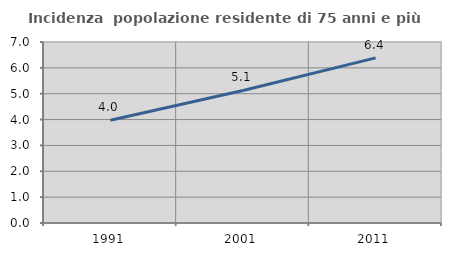
| Category | Incidenza  popolazione residente di 75 anni e più |
|---|---|
| 1991.0 | 3.976 |
| 2001.0 | 5.125 |
| 2011.0 | 6.385 |